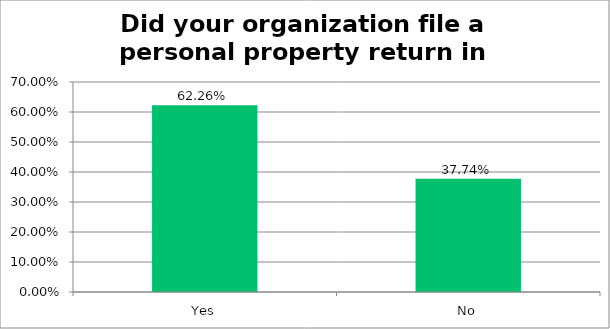
| Category | Responses |
|---|---|
| Yes | 0.623 |
| No | 0.377 |